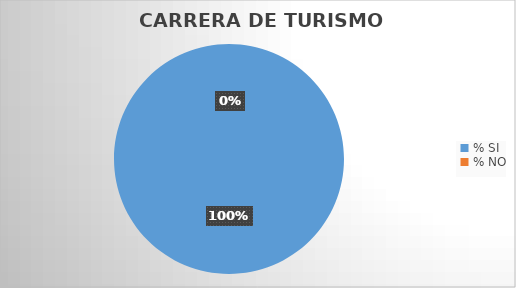
| Category | Series 0 |
|---|---|
| % SI | 100 |
| % NO | 0 |